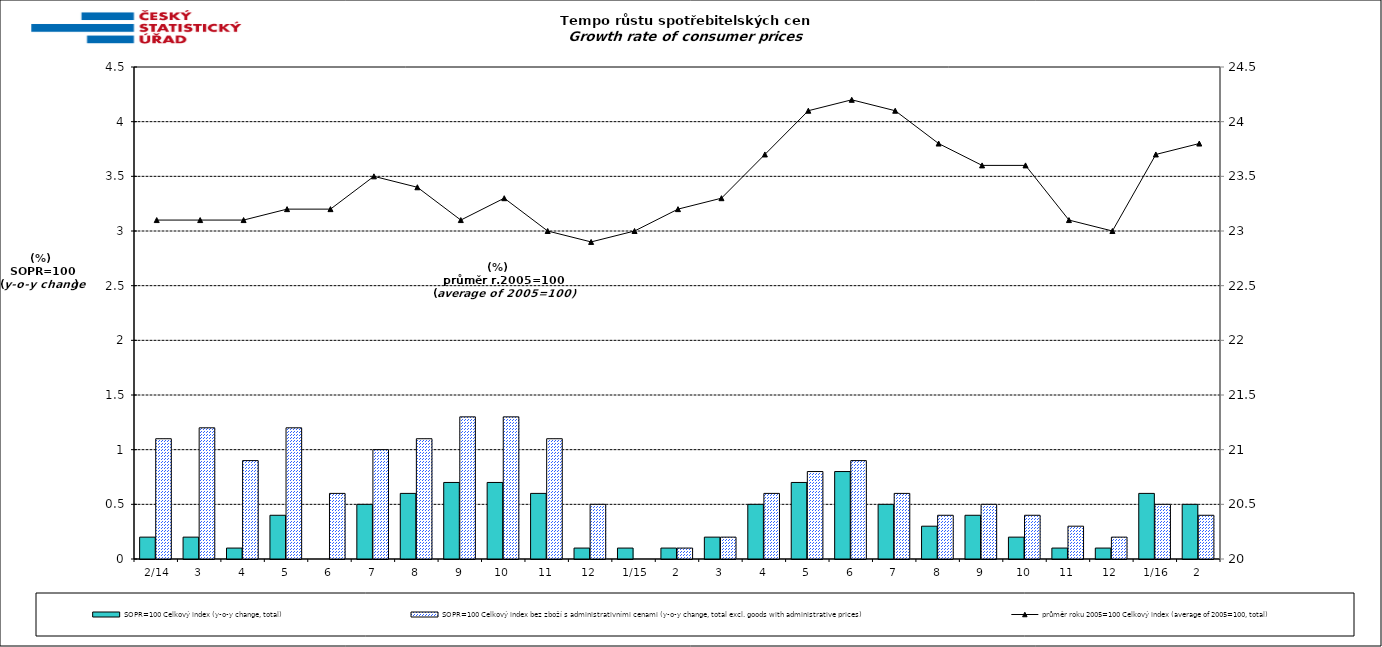
| Category | SOPR=100 Celkový index (y-o-y change, total) | SOPR=100 Celkový index bez zboží s administrativními cenami (y-o-y change, total excl. goods with administrative prices)  |
|---|---|---|
|  2/14 | 0.2 | 1.1 |
| 3 | 0.2 | 1.2 |
| 4 | 0.1 | 0.9 |
| 5 | 0.4 | 1.2 |
| 6 | 0 | 0.6 |
| 7 | 0.5 | 1 |
| 8 | 0.6 | 1.1 |
| 9 | 0.7 | 1.3 |
| 10 | 0.7 | 1.3 |
| 11 | 0.6 | 1.1 |
| 12 | 0.1 | 0.5 |
|  1/15 | 0.1 | 0 |
| 2 | 0.1 | 0.1 |
| 3 | 0.2 | 0.2 |
| 4 | 0.5 | 0.6 |
| 5 | 0.7 | 0.8 |
| 6 | 0.8 | 0.9 |
| 7 | 0.5 | 0.6 |
| 8 | 0.3 | 0.4 |
| 9 | 0.4 | 0.5 |
| 10 | 0.2 | 0.4 |
| 11 | 0.1 | 0.3 |
| 12 | 0.1 | 0.2 |
|  1/16 | 0.6 | 0.5 |
| 2 | 0.5 | 0.4 |